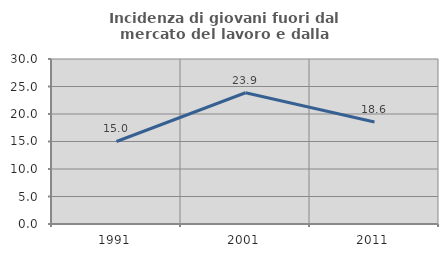
| Category | Incidenza di giovani fuori dal mercato del lavoro e dalla formazione  |
|---|---|
| 1991.0 | 15.005 |
| 2001.0 | 23.863 |
| 2011.0 | 18.551 |